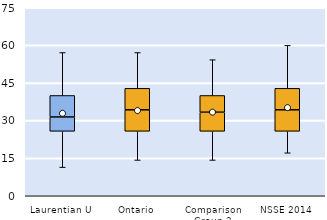
| Category | 25th | 50th | 75th |
|---|---|---|---|
| Laurentian U | 25.714 | 5.714 | 8.571 |
| Ontario | 25.714 | 8.571 | 8.571 |
| Comparison Group 2 | 25.714 | 7.619 | 6.667 |
| NSSE 2014 | 25.714 | 8.571 | 8.571 |